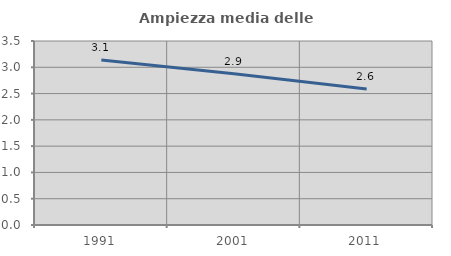
| Category | Ampiezza media delle famiglie |
|---|---|
| 1991.0 | 3.14 |
| 2001.0 | 2.879 |
| 2011.0 | 2.587 |